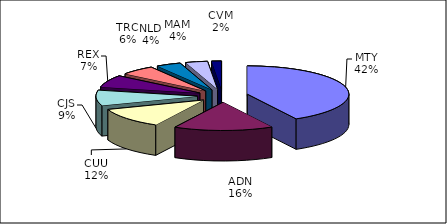
| Category | Series 0 |
|---|---|
| MTY | 114530 |
| ADN | 43116 |
| CUU | 32034 |
| CJS | 24147 |
| REX | 19009 |
| TRC | 15182 |
| NLD | 10755 |
| MAM | 9562 |
| CVM | 4289 |